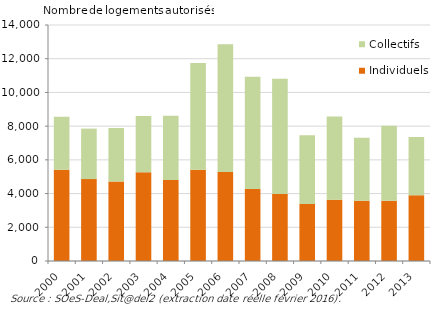
| Category | Individuels | Collectifs |
|---|---|---|
| 2000.0 | 5418 | 3135 |
| 2001.0 | 4859 | 2994 |
| 2002.0 | 4720 | 3170 |
| 2003.0 | 5265 | 3343 |
| 2004.0 | 4810 | 3808 |
| 2005.0 | 5412 | 6338 |
| 2006.0 | 5287 | 7577 |
| 2007.0 | 4265 | 6665 |
| 2008.0 | 3972 | 6835 |
| 2009.0 | 3381 | 4077 |
| 2010.0 | 3633 | 4943 |
| 2011.0 | 3569 | 3740 |
| 2012.0 | 3573 | 4450 |
| 2013.0 | 3904 | 3452 |